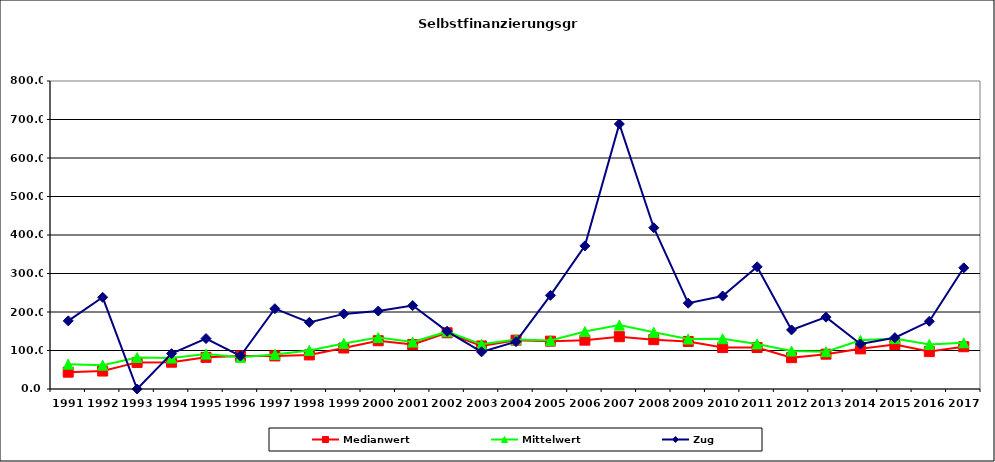
| Category | Medianwert | Mittelwert | Zug |
|---|---|---|---|
| 1991.0 | 43.7 | 64.292 | 177 |
| 1992.0 | 46.65 | 61.956 | 238.2 |
| 1993.0 | 69.1 | 81.629 | 0 |
| 1994.0 | 69.6 | 80.414 | 91.9 |
| 1995.0 | 82.2 | 90.605 | 131.1 |
| 1996.0 | 85.7 | 82.181 | 85.7 |
| 1997.0 | 85.95 | 89.873 | 208.6 |
| 1998.0 | 88.55 | 100.246 | 173.1 |
| 1999.0 | 106.5 | 118.448 | 195.1 |
| 2000.0 | 125.4 | 133.52 | 202.5 |
| 2001.0 | 115.55 | 121.946 | 216.7 |
| 2002.0 | 146 | 148.915 | 149.8 |
| 2003.0 | 111.85 | 116.062 | 96.5 |
| 2004.0 | 126.9 | 128.865 | 123.1 |
| 2005.0 | 124.25 | 125.821 | 243.3 |
| 2006.0 | 126.9 | 149.264 | 371.7 |
| 2007.0 | 135.85 | 165.89 | 688.4 |
| 2008.0 | 128.185 | 147.205 | 418.9 |
| 2009.0 | 123.49 | 129.818 | 222.9 |
| 2010.0 | 107.55 | 130.614 | 241.5 |
| 2011.0 | 107.75 | 117.142 | 317.51 |
| 2012.0 | 81.375 | 98.616 | 153.44 |
| 2013.0 | 90.385 | 96.916 | 186.61 |
| 2014.0 | 104.25 | 126.395 | 116.882 |
| 2015.0 | 115.5 | 130.9 | 133.336 |
| 2016.0 | 97.18 | 115.832 | 175.882 |
| 2017.0 | 109.75 | 119.906 | 314.771 |